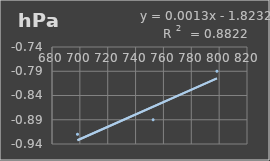
| Category | Presión Atmosférica |
|---|---|
| 698.3 | -0.92 |
| 752.6 | -0.89 |
| 798.4 | -0.79 |